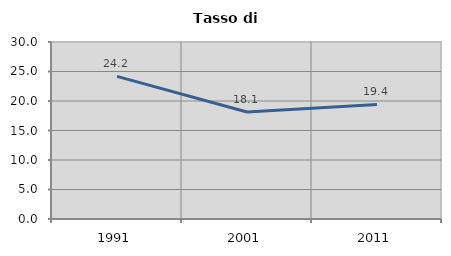
| Category | Tasso di disoccupazione   |
|---|---|
| 1991.0 | 24.172 |
| 2001.0 | 18.133 |
| 2011.0 | 19.427 |